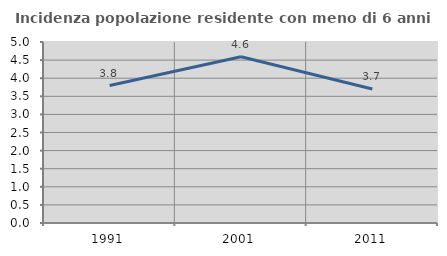
| Category | Incidenza popolazione residente con meno di 6 anni |
|---|---|
| 1991.0 | 3.797 |
| 2001.0 | 4.595 |
| 2011.0 | 3.704 |